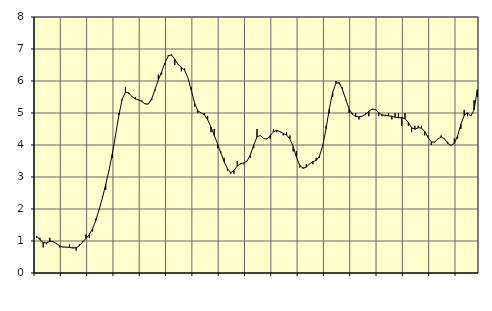
| Category | Piggar | Series 1 |
|---|---|---|
| nan | 1.1 | 1.15 |
| 87.0 | 1.1 | 1.04 |
| 87.0 | 0.8 | 0.95 |
| 87.0 | 0.9 | 0.94 |
| nan | 1.1 | 0.99 |
| 88.0 | 1 | 0.98 |
| 88.0 | 0.9 | 0.92 |
| 88.0 | 0.8 | 0.85 |
| nan | 0.8 | 0.81 |
| 89.0 | 0.8 | 0.81 |
| 89.0 | 0.9 | 0.8 |
| 89.0 | 0.8 | 0.78 |
| nan | 0.7 | 0.79 |
| 90.0 | 0.9 | 0.85 |
| 90.0 | 1 | 0.97 |
| 90.0 | 1.2 | 1.08 |
| nan | 1.1 | 1.2 |
| 91.0 | 1.3 | 1.38 |
| 91.0 | 1.7 | 1.65 |
| 91.0 | 2 | 1.98 |
| nan | 2.4 | 2.35 |
| 92.0 | 2.6 | 2.77 |
| 92.0 | 3.2 | 3.21 |
| 92.0 | 3.6 | 3.72 |
| nan | 4.3 | 4.31 |
| 93.0 | 5 | 4.93 |
| 93.0 | 5.4 | 5.43 |
| 93.0 | 5.8 | 5.65 |
| nan | 5.6 | 5.63 |
| 94.0 | 5.5 | 5.51 |
| 94.0 | 5.5 | 5.44 |
| 94.0 | 5.4 | 5.41 |
| nan | 5.4 | 5.36 |
| 95.0 | 5.3 | 5.28 |
| 95.0 | 5.3 | 5.28 |
| 95.0 | 5.4 | 5.45 |
| nan | 5.7 | 5.74 |
| 96.0 | 6.2 | 6.03 |
| 96.0 | 6.2 | 6.29 |
| 96.0 | 6.5 | 6.56 |
| nan | 6.8 | 6.78 |
| 97.0 | 6.8 | 6.82 |
| 97.0 | 6.5 | 6.68 |
| 97.0 | 6.5 | 6.52 |
| nan | 6.3 | 6.43 |
| 98.0 | 6.4 | 6.33 |
| 98.0 | 6.1 | 6.1 |
| 98.0 | 5.8 | 5.72 |
| nan | 5.2 | 5.32 |
| 99.0 | 5 | 5.07 |
| 99.0 | 5 | 5 |
| 99.0 | 5 | 4.95 |
| nan | 4.9 | 4.79 |
| 0.0 | 4.4 | 4.56 |
| 0.0 | 4.5 | 4.3 |
| 0.0 | 3.9 | 4.04 |
| nan | 3.8 | 3.75 |
| 1.0 | 3.6 | 3.48 |
| 1.0 | 3.2 | 3.26 |
| 1.0 | 3.1 | 3.14 |
| nan | 3.1 | 3.2 |
| 2.0 | 3.5 | 3.34 |
| 2.0 | 3.4 | 3.42 |
| 2.0 | 3.4 | 3.44 |
| nan | 3.5 | 3.5 |
| 3.0 | 3.6 | 3.7 |
| 3.0 | 3.9 | 4 |
| 3.0 | 4.5 | 4.25 |
| nan | 4.3 | 4.3 |
| 4.0 | 4.2 | 4.2 |
| 4.0 | 4.2 | 4.19 |
| 4.0 | 4.2 | 4.29 |
| nan | 4.5 | 4.41 |
| 5.0 | 4.4 | 4.46 |
| 5.0 | 4.4 | 4.42 |
| 5.0 | 4.3 | 4.36 |
| nan | 4.4 | 4.31 |
| 6.0 | 4.3 | 4.19 |
| 6.0 | 3.8 | 3.95 |
| 6.0 | 3.8 | 3.62 |
| nan | 3.3 | 3.36 |
| 7.0 | 3.3 | 3.27 |
| 7.0 | 3.4 | 3.31 |
| 7.0 | 3.4 | 3.41 |
| nan | 3.4 | 3.48 |
| 8.0 | 3.6 | 3.52 |
| 8.0 | 3.6 | 3.65 |
| 8.0 | 4 | 3.99 |
| nan | 4.6 | 4.51 |
| 9.0 | 5 | 5.14 |
| 9.0 | 5.5 | 5.64 |
| 9.0 | 6 | 5.93 |
| nan | 5.9 | 5.95 |
| 10.0 | 5.8 | 5.73 |
| 10.0 | 5.4 | 5.42 |
| 10.0 | 5 | 5.13 |
| nan | 5 | 4.96 |
| 11.0 | 5 | 4.89 |
| 11.0 | 4.8 | 4.88 |
| 11.0 | 4.9 | 4.9 |
| nan | 5 | 4.96 |
| 12.0 | 4.9 | 5.05 |
| 12.0 | 5.1 | 5.12 |
| 12.0 | 5.1 | 5.11 |
| nan | 4.9 | 5.01 |
| 13.0 | 4.9 | 4.94 |
| 13.0 | 4.9 | 4.93 |
| 13.0 | 5 | 4.91 |
| nan | 4.8 | 4.9 |
| 14.0 | 5 | 4.87 |
| 14.0 | 5 | 4.85 |
| 14.0 | 4.6 | 4.86 |
| nan | 5 | 4.82 |
| 15.0 | 4.6 | 4.71 |
| 15.0 | 4.4 | 4.54 |
| 15.0 | 4.6 | 4.49 |
| nan | 4.6 | 4.54 |
| 16.0 | 4.6 | 4.53 |
| 16.0 | 4.3 | 4.42 |
| 16.0 | 4.3 | 4.24 |
| nan | 4 | 4.1 |
| 17.0 | 4.1 | 4.09 |
| 17.0 | 4.2 | 4.19 |
| 17.0 | 4.3 | 4.25 |
| nan | 4.2 | 4.19 |
| 18.0 | 4.1 | 4.05 |
| 18.0 | 4 | 3.99 |
| 18.0 | 4.2 | 4.05 |
| nan | 4.2 | 4.29 |
| 19.0 | 4.5 | 4.65 |
| 19.0 | 5.1 | 4.92 |
| 19.0 | 4.9 | 5.01 |
| nan | 4.9 | 4.9 |
| 20.0 | 5.4 | 5.1 |
| 20.0 | 5.5 | 5.73 |